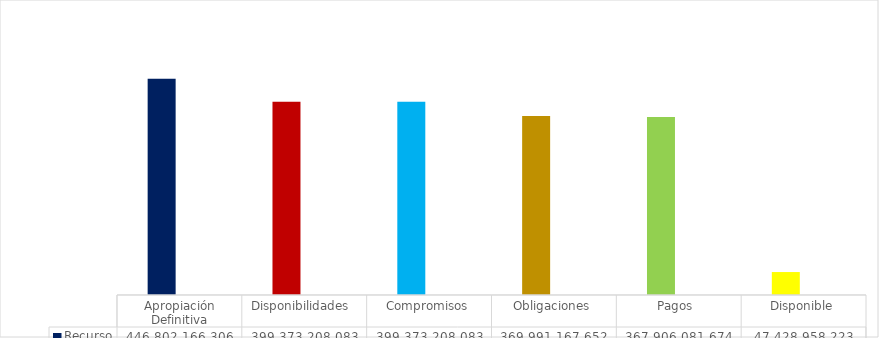
| Category | Recurso  | % |
|---|---|---|
| Apropiación Definitiva | 446802166306.12 | 1 |
| Disponibilidades  | 399373208082.83 | 0.894 |
| Compromisos | 399373208082.83 | 0.894 |
| Obligaciones | 369991167652.49 | 0.828 |
| Pagos  | 367906081674.49 | 0.823 |
| Disponible | 47428958223.29 | 0.106 |